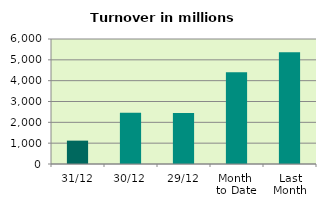
| Category | Series 0 |
|---|---|
| 31/12 | 1121.373 |
| 30/12 | 2461.149 |
| 29/12 | 2445.423 |
| Month 
to Date | 4407.558 |
| Last
Month | 5362.851 |